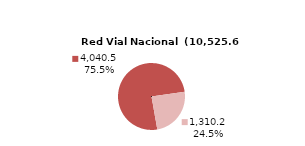
| Category | RV Nacional |
|---|---|
| Pavimentada | 4040.461 |
| No Pavimentada | 1310.175 |